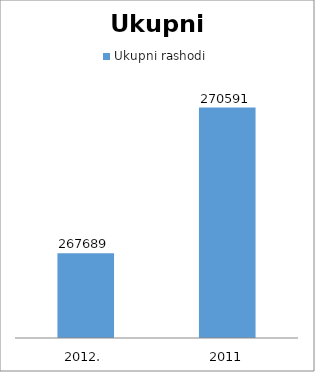
| Category | Ukupni rashodi |
|---|---|
| 2012. | 267689 |
| 2011 | 270591 |